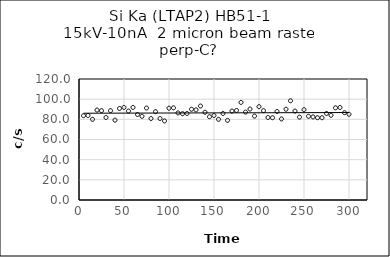
| Category | Series 0 |
|---|---|
| 5.0 | 83.6 |
| 10.0 | 83.8 |
| 15.0 | 80 |
| 20.0 | 89.2 |
| 25.0 | 88.6 |
| 30.0 | 81.8 |
| 35.0 | 88.6 |
| 40.0 | 79.2 |
| 45.0 | 90.8 |
| 50.0 | 91.8 |
| 55.0 | 88.2 |
| 60.0 | 91.8 |
| 65.0 | 84.8 |
| 70.0 | 83 |
| 75.0 | 91.2 |
| 80.0 | 80.8 |
| 85.0 | 87.6 |
| 90.0 | 80.8 |
| 95.0 | 78.4 |
| 100.0 | 91 |
| 105.0 | 91.4 |
| 110.0 | 86.4 |
| 115.0 | 85.6 |
| 120.0 | 85.8 |
| 125.0 | 90 |
| 130.0 | 89.4 |
| 135.0 | 93.2 |
| 140.0 | 87 |
| 145.0 | 82.6 |
| 150.0 | 83.8 |
| 155.0 | 80 |
| 160.0 | 85.8 |
| 165.0 | 79 |
| 170.0 | 88.2 |
| 175.0 | 88.8 |
| 180.0 | 96.8 |
| 185.0 | 87.2 |
| 190.0 | 90.2 |
| 195.0 | 83.2 |
| 200.0 | 92.6 |
| 205.0 | 88.6 |
| 210.0 | 81.8 |
| 215.0 | 81.6 |
| 220.0 | 87.8 |
| 225.0 | 80.4 |
| 230.0 | 90 |
| 235.0 | 98.4 |
| 240.0 | 88.2 |
| 245.0 | 82.2 |
| 250.0 | 89.6 |
| 255.0 | 83 |
| 260.0 | 82.4 |
| 265.0 | 81.6 |
| 270.0 | 81.6 |
| 275.0 | 85.8 |
| 280.0 | 84 |
| 285.0 | 91.4 |
| 290.0 | 91.8 |
| 295.0 | 86.6 |
| 300.0 | 85 |